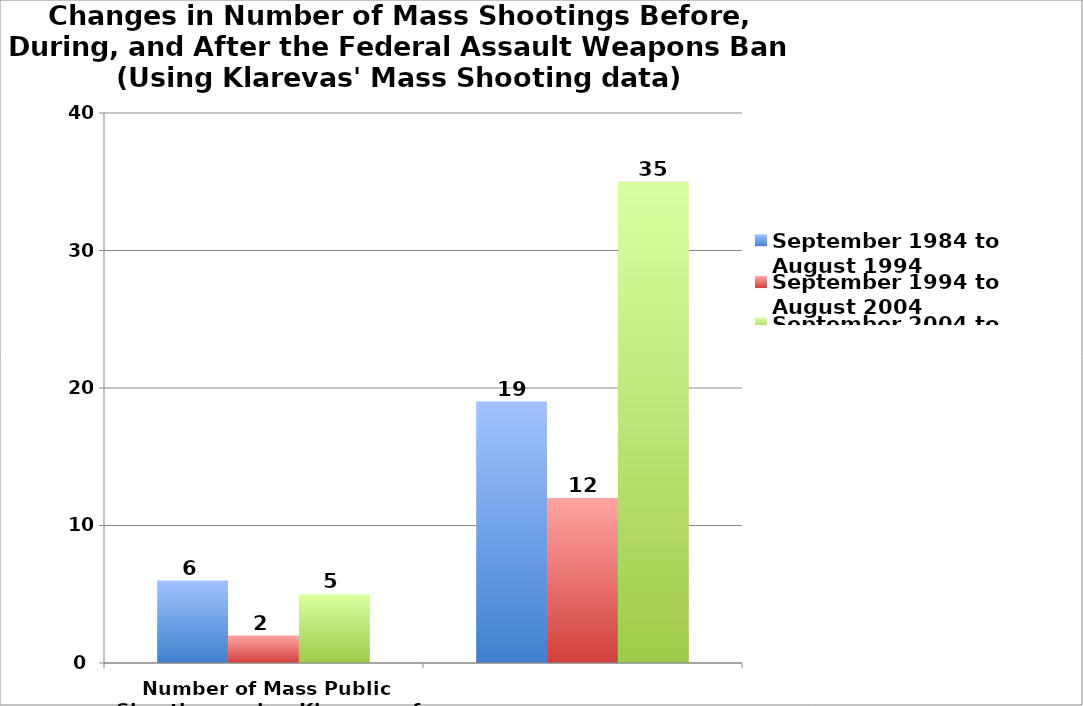
| Category | September 1984 to August 1994 | September 1994 to August 2004 | September 2004 to August 2014 |
|---|---|---|---|
| Number of Mass Public Shootings using Klaveras of 6 or more killed | 6 | 2 | 5 |
|  | 19 | 12 | 35 |